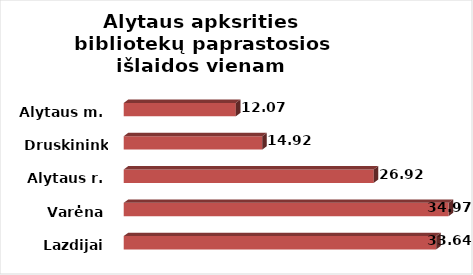
| Category | Series 0 |
|---|---|
| Lazdijai | 33.635 |
| Varėna | 34.972 |
| Alytaus r. | 26.917 |
| Druskininkai | 14.915 |
| Alytaus m. | 12.067 |